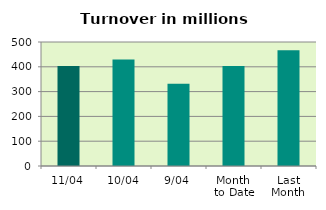
| Category | Series 0 |
|---|---|
| 11/04 | 403.709 |
| 10/04 | 429.206 |
| 9/04 | 332.042 |
| Month 
to Date | 403.554 |
| Last
Month | 466.511 |